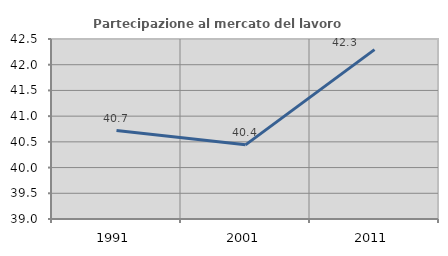
| Category | Partecipazione al mercato del lavoro  femminile |
|---|---|
| 1991.0 | 40.721 |
| 2001.0 | 40.442 |
| 2011.0 | 42.294 |